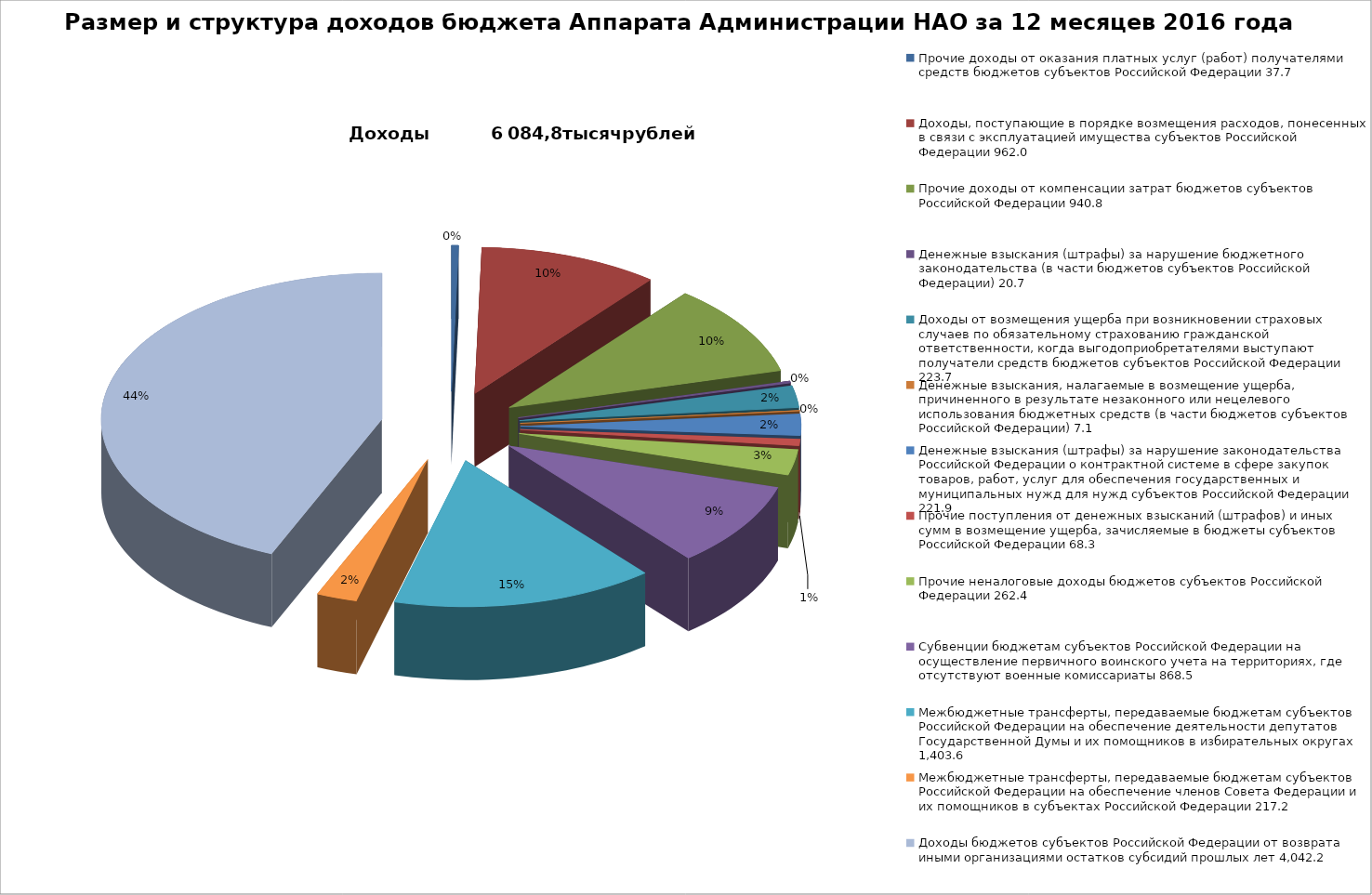
| Category | Размер и структура доходов бюджета Аппарата Администрации НАО за 1 квартал 2017 года |
|---|---|
| 0 | 37.7 |
| 1 | 962 |
| 2 | 940.8 |
| 3 | 20.7 |
| 4 | 223.7 |
| 5 | 7.1 |
| 6 | 221.9 |
| 7 | 68.3 |
| 8 | 262.4 |
| 9 | 868.5 |
| 10 | 1403.6 |
| 11 | 217.2 |
| 12 | 4042.2 |